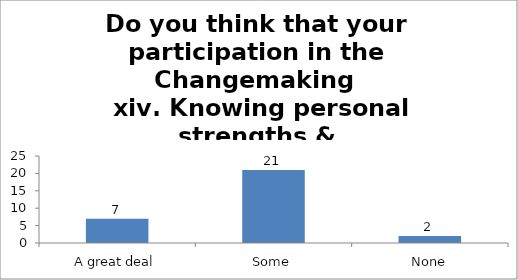
| Category | Do you think that your participation in the Changemaking 
 xiv. Knowing personal strengths & weaknesses.   |
|---|---|
| A great deal | 7 |
| Some | 21 |
| None | 2 |